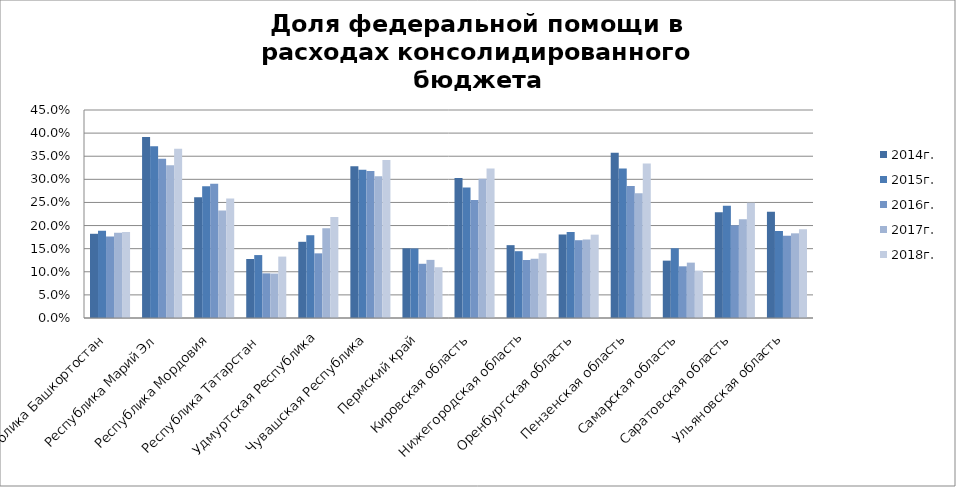
| Category | 2013г. | 2014г. | 2015г. | 2016г. | 2017г. | 2018г. |
|---|---|---|---|---|---|---|
| Республика Башкортостан |  | 0.182 | 0.189 | 0.176 | 0.184 | 0.186 |
| Республика Марий Эл |  | 0.392 | 0.372 | 0.344 | 0.331 | 0.366 |
| Республика Мордовия |  | 0.261 | 0.285 | 0.29 | 0.233 | 0.258 |
| Республика Татарстан  |  | 0.128 | 0.136 | 0.097 | 0.096 | 0.133 |
| Удмуртская Республика |  | 0.165 | 0.179 | 0.14 | 0.194 | 0.218 |
| Чувашская Республика |  | 0.328 | 0.321 | 0.318 | 0.306 | 0.342 |
| Пермский край |  | 0.151 | 0.15 | 0.117 | 0.126 | 0.11 |
| Кировская область |  | 0.303 | 0.282 | 0.255 | 0.301 | 0.323 |
| Нижегородская область |  | 0.158 | 0.145 | 0.125 | 0.128 | 0.14 |
| Оренбургская область |  | 0.181 | 0.186 | 0.168 | 0.17 | 0.18 |
| Пензенская область |  | 0.358 | 0.323 | 0.285 | 0.27 | 0.334 |
| Самарская область |  | 0.124 | 0.151 | 0.112 | 0.12 | 0.103 |
| Саратовская область |  | 0.229 | 0.243 | 0.201 | 0.214 | 0.249 |
| Ульяновская область |  | 0.23 | 0.188 | 0.178 | 0.183 | 0.192 |